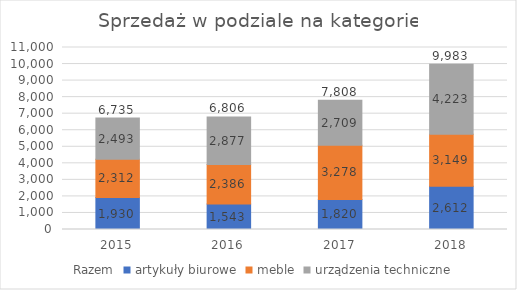
| Category | Razem |
|---|---|
| 2015.0 | 6735.165 |
| 2016.0 | 6805.776 |
| 2017.0 | 7807.559 |
| 2018.0 | 9983.259 |